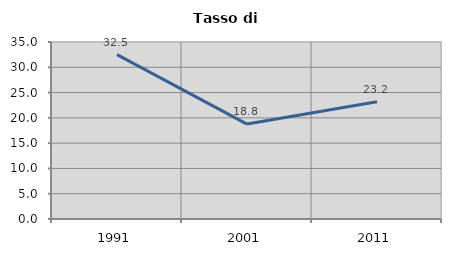
| Category | Tasso di disoccupazione   |
|---|---|
| 1991.0 | 32.507 |
| 2001.0 | 18.773 |
| 2011.0 | 23.188 |